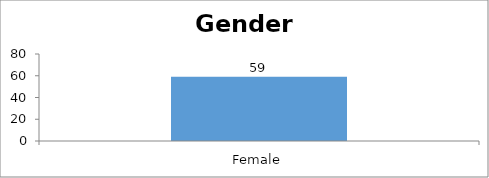
| Category | Gender |
|---|---|
| Female | 59 |